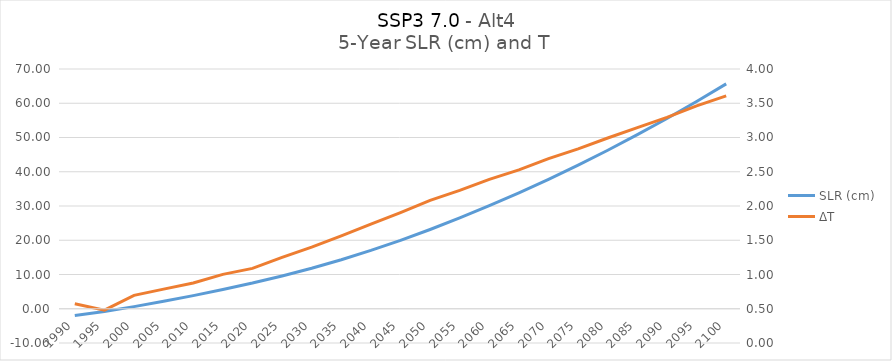
| Category | SLR (cm) |
|---|---|
| 1990.0 | -1.941 |
| 1995.0 | -0.818 |
| 2000.0 | 0.621 |
| 2005.0 | 2.18 |
| 2010.0 | 3.834 |
| 2015.0 | 5.633 |
| 2020.0 | 7.505 |
| 2025.0 | 9.582 |
| 2030.0 | 11.846 |
| 2035.0 | 14.32 |
| 2040.0 | 17.026 |
| 2045.0 | 19.96 |
| 2050.0 | 23.142 |
| 2055.0 | 26.507 |
| 2060.0 | 30.082 |
| 2065.0 | 33.827 |
| 2070.0 | 37.794 |
| 2075.0 | 41.934 |
| 2080.0 | 46.284 |
| 2085.0 | 50.826 |
| 2090.0 | 55.559 |
| 2095.0 | 60.522 |
| 2100.0 | 65.666 |